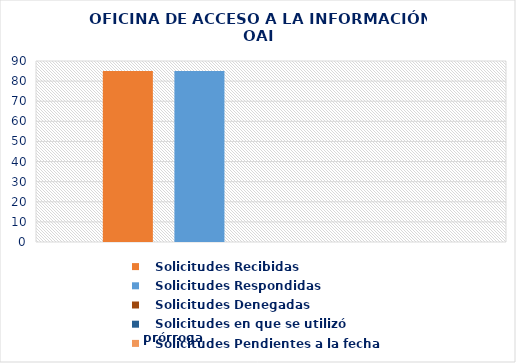
| Category |    Solicitudes Recibidas |    Solicitudes Respondidas |    Solicitudes Denegadas |    Solicitudes en que se utilizó prórroga |    Solicitudes Pendientes a la fecha |
|---|---|---|---|---|---|
| 0 | 85 | 85 | 0 | 0 | 0 |